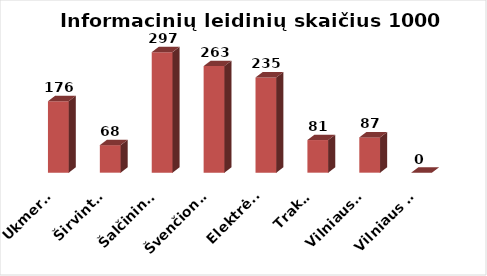
| Category | Series 0 |
|---|---|
| Ukmergė | 176.383 |
| Širvintos | 67.982 |
| Šalčininkai | 297.485 |
| Švenčionys | 263.076 |
| Elektrėnai | 234.982 |
| Trakai | 80.552 |
| Vilniaus r. | 87.113 |
| Vilniaus m. | 0 |